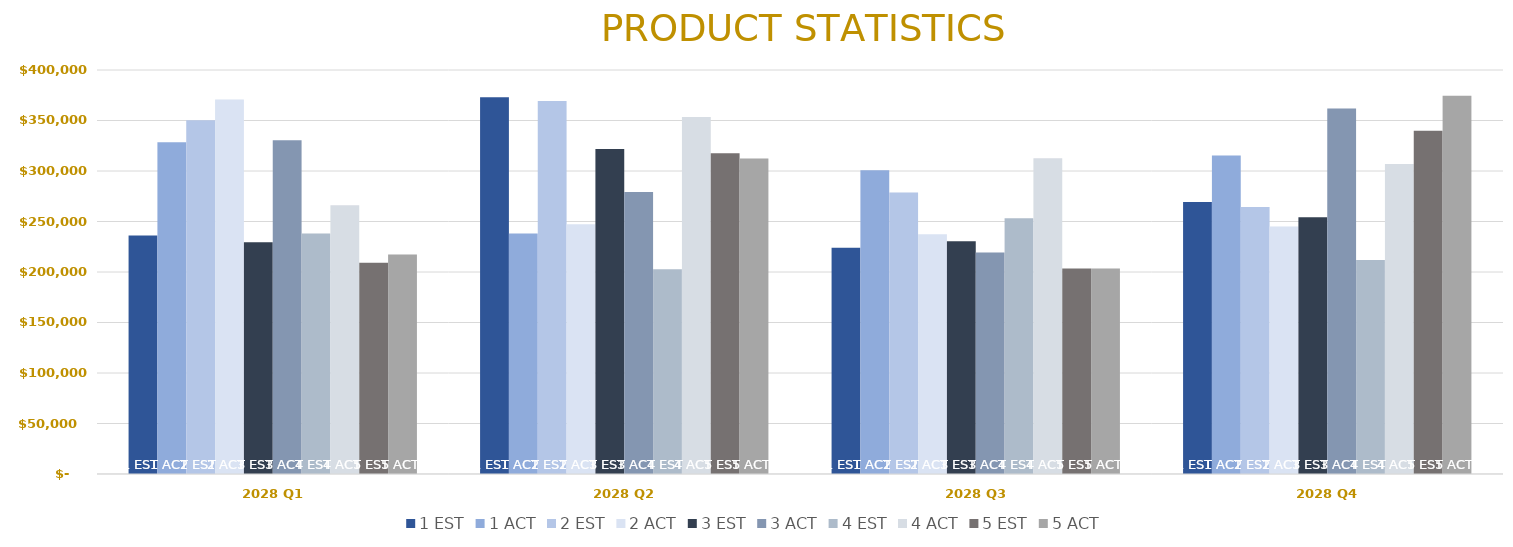
| Category | 1 | 2 | 3 | 4 | 5 |
|---|---|---|---|---|---|
| 2028 Q1 | 328554 | 370834 | 330368 | 266070 | 217289 |
| 2028 Q2 | 238136 | 247324 | 279114 | 353563 | 312312 |
| 2028 Q3 | 300822 | 237385 | 219257 | 312586 | 203487 |
| 2028 Q4 | 315337 | 245048 | 361880 | 306970 | 374445 |